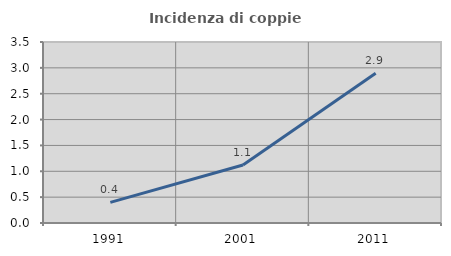
| Category | Incidenza di coppie miste |
|---|---|
| 1991.0 | 0.399 |
| 2001.0 | 1.121 |
| 2011.0 | 2.897 |